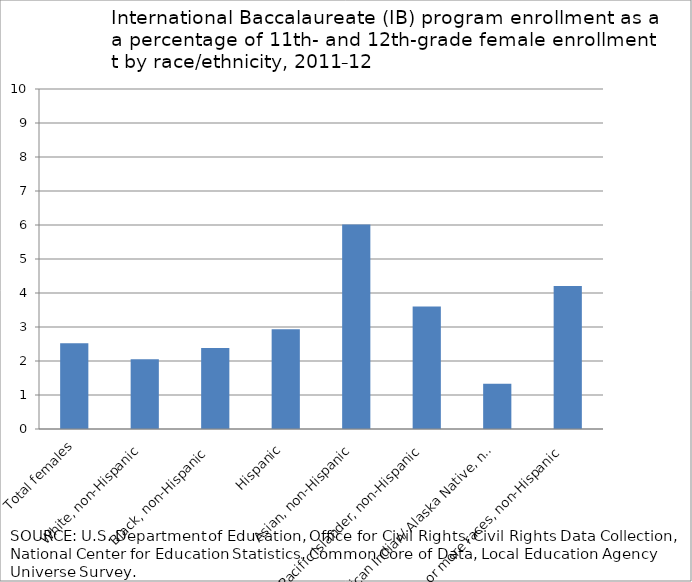
| Category | Series 0 |
|---|---|
| Total females | 2.525 |
|    White, non-Hispanic | 2.051 |
|    Black, non-Hispanic  | 2.381 |
|    Hispanic | 2.935 |
|    Asian, non-Hispanic | 6.016 |
|    Pacific Islander, non-Hispanic | 3.6 |
|    American Indian/ Alaska Native, non-Hispanic | 1.332 |
|    Two or more races, non-Hispanic | 4.205 |